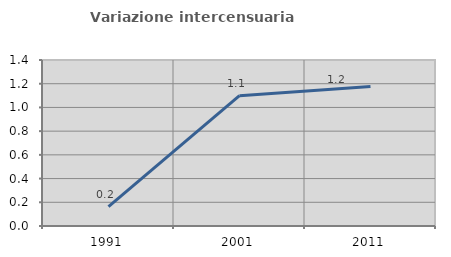
| Category | Variazione intercensuaria annua |
|---|---|
| 1991.0 | 0.164 |
| 2001.0 | 1.099 |
| 2011.0 | 1.176 |